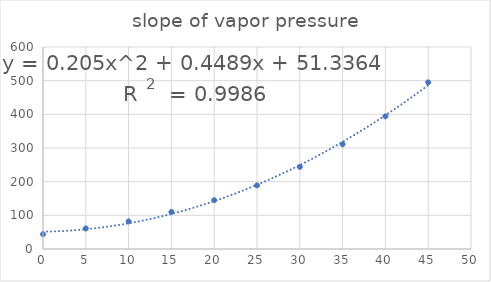
| Category | slope of vapor pressure |
|---|---|
| 0.0 | 44 |
| 5.0 | 61 |
| 10.0 | 82 |
| 15.0 | 110 |
| 20.0 | 145 |
| 25.0 | 189 |
| 30.0 | 244 |
| 35.0 | 311 |
| 40.0 | 394 |
| 45.0 | 495 |